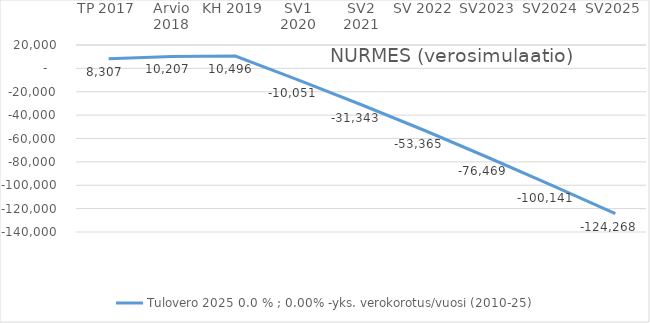
| Category | Tulovero 2025 |
|---|---|
| TP 2017 | 8307 |
| Arvio 2018 | 10206.818 |
| KH 2019 | 10496.253 |
| SV1 2020 | -10050.611 |
| SV2 2021 | -31343.452 |
| SV 2022 | -53365.228 |
| SV2023 | -76468.516 |
| SV2024 | -100141.474 |
| SV2025 | -124268.483 |